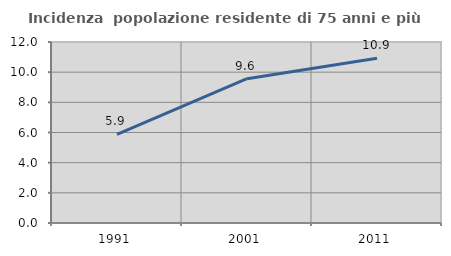
| Category | Incidenza  popolazione residente di 75 anni e più |
|---|---|
| 1991.0 | 5.877 |
| 2001.0 | 9.569 |
| 2011.0 | 10.919 |